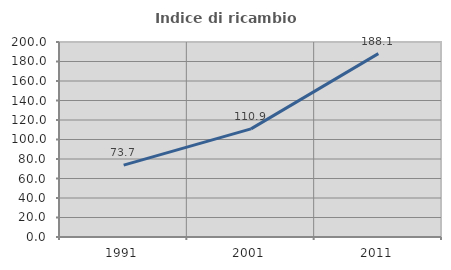
| Category | Indice di ricambio occupazionale  |
|---|---|
| 1991.0 | 73.713 |
| 2001.0 | 110.924 |
| 2011.0 | 188.06 |